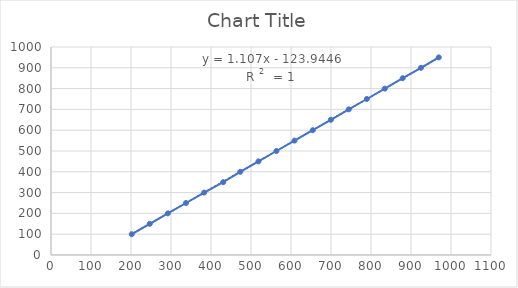
| Category | Series 0 |
|---|---|
| 201.86 | 100 |
| 246.82500000000002 | 150 |
| 292.03499999999997 | 200 |
| 337.4925 | 250 |
| 382.945 | 300 |
| 430.41 | 350 |
| 473.12 | 400 |
| 518.575 | 450 |
| 563.54 | 500 |
| 608.75 | 550 |
| 654.45 | 600 |
| 699.6600000000001 | 650 |
| 744.3825 | 700 |
| 789.59 | 750 |
| 834.5575 | 800 |
| 879.2825 | 850 |
| 924.98 | 900 |
| 969.4499999999999 | 950 |